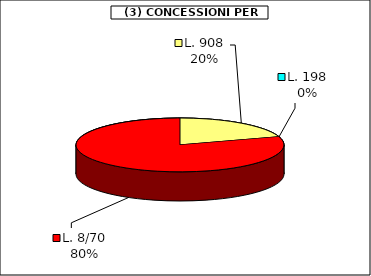
| Category | Series 0 |
|---|---|
| L. 908 | 10829 |
| L. 198 | 0 |
| L. 8/70 | 43126.5 |